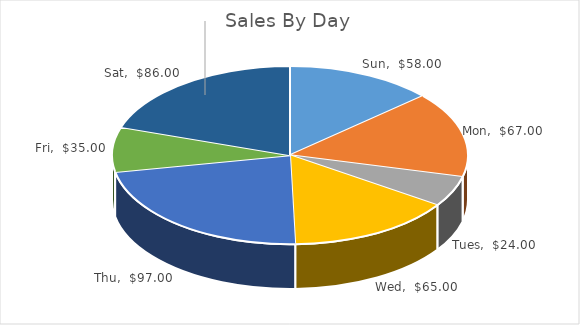
| Category | Sales |
|---|---|
| Sun | 58 |
| Mon | 67 |
| Tues | 24 |
| Wed | 65 |
| Thu | 97 |
| Fri | 35 |
| Sat | 86 |